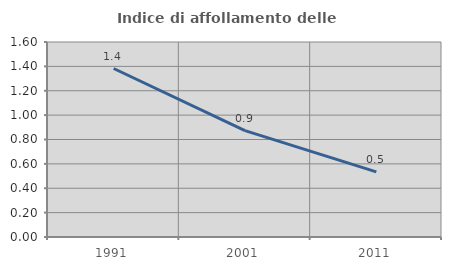
| Category | Indice di affollamento delle abitazioni  |
|---|---|
| 1991.0 | 1.382 |
| 2001.0 | 0.873 |
| 2011.0 | 0.535 |